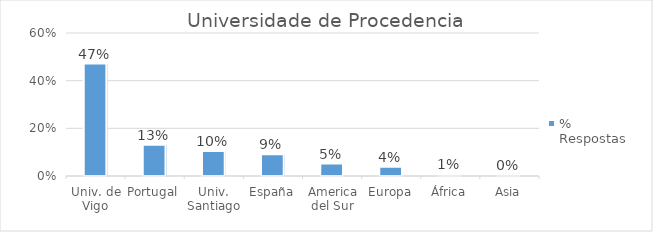
| Category | % Respostas |
|---|---|
| Univ. de Vigo | 0.472 |
| Portugal | 0.131 |
| Univ. Santiago | 0.105 |
| España | 0.092 |
| America del Sur | 0.052 |
| Europa | 0.039 |
| África | 0.009 |
| Asia | 0.004 |